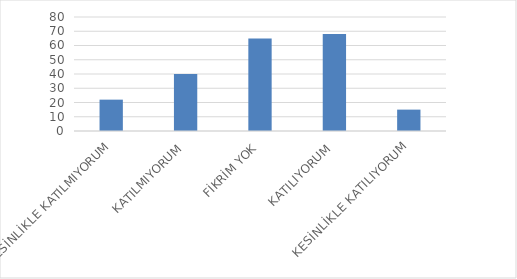
| Category | Series 0 |
|---|---|
| KESİNLİKLE KATILMIYORUM | 22 |
| KATILMIYORUM | 40 |
| FİKRİM YOK | 65 |
| KATILIYORUM | 68 |
| KESİNLİKLE KATILIYORUM | 15 |